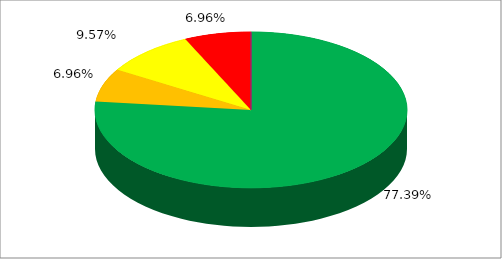
| Category | Series 0 |
|---|---|
| 0 | 0.774 |
| 1 | 0.07 |
| 2 | 0.096 |
| 3 | 0.07 |
| 4 | 0 |